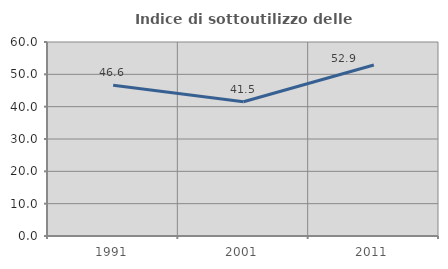
| Category | Indice di sottoutilizzo delle abitazioni  |
|---|---|
| 1991.0 | 46.628 |
| 2001.0 | 41.502 |
| 2011.0 | 52.881 |